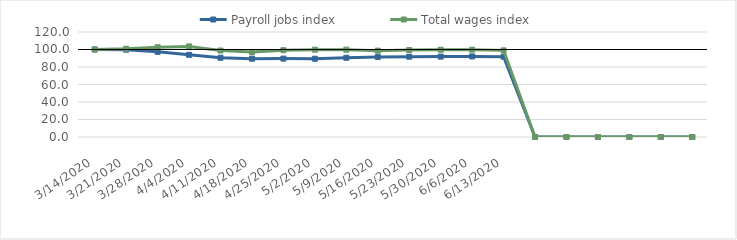
| Category | Payroll jobs index | Total wages index |
|---|---|---|
| 14/03/2020 | 100 | 100 |
| 21/03/2020 | 99.79 | 100.838 |
| 28/03/2020 | 97.301 | 102.596 |
| 04/04/2020 | 93.914 | 103.55 |
| 11/04/2020 | 90.576 | 98.844 |
| 18/04/2020 | 89.541 | 97.012 |
| 25/04/2020 | 89.608 | 99.23 |
| 02/05/2020 | 89.441 | 99.802 |
| 09/05/2020 | 90.583 | 99.795 |
| 16/05/2020 | 91.501 | 98.706 |
| 23/05/2020 | 91.777 | 99.393 |
| 30/05/2020 | 91.858 | 99.76 |
| 06/06/2020 | 92.085 | 99.798 |
| 13/06/2020 | 91.806 | 99.008 |